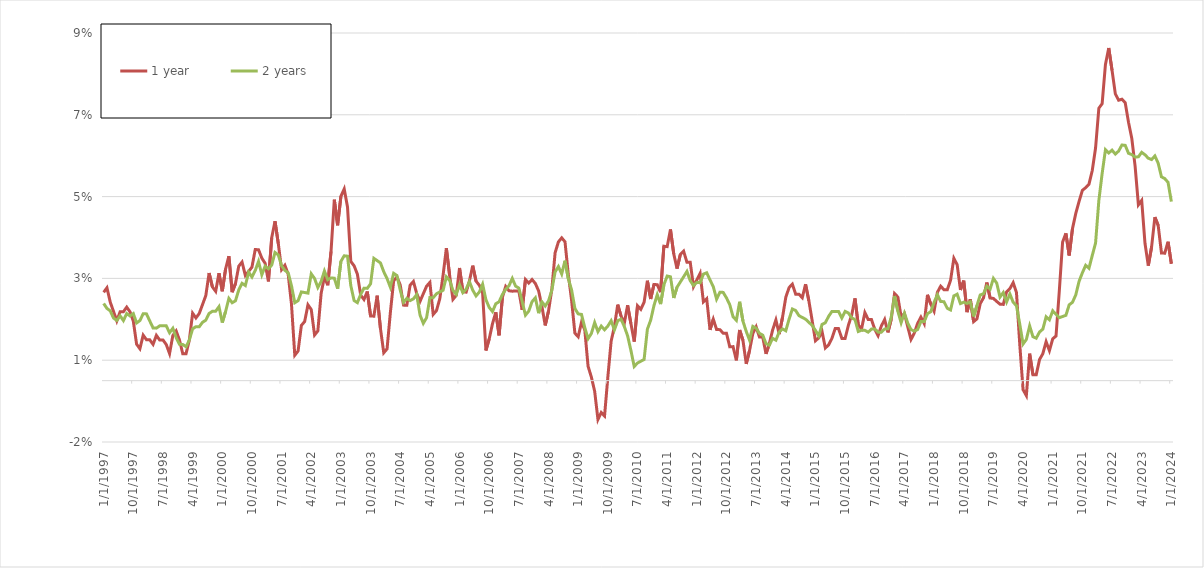
| Category | 1 year | 2 years |
|---|---|---|
| 1/1/97 | 0.022 | 0.019 |
| 2/1/97 | 0.023 | 0.018 |
| 3/1/97 | 0.019 | 0.017 |
| 4/1/97 | 0.017 | 0.015 |
| 5/1/97 | 0.015 | 0.015 |
| 6/1/97 | 0.017 | 0.016 |
| 7/1/97 | 0.017 | 0.015 |
| 8/1/97 | 0.018 | 0.016 |
| 9/1/97 | 0.017 | 0.016 |
| 10/1/97 | 0.015 | 0.016 |
| 11/1/97 | 0.009 | 0.014 |
| 12/1/97 | 0.008 | 0.015 |
| 1/1/98 | 0.011 | 0.016 |
| 2/1/98 | 0.01 | 0.016 |
| 3/1/98 | 0.01 | 0.015 |
| 4/1/98 | 0.009 | 0.013 |
| 5/1/98 | 0.011 | 0.013 |
| 6/1/98 | 0.01 | 0.013 |
| 7/1/98 | 0.01 | 0.013 |
| 8/1/98 | 0.009 | 0.013 |
| 9/1/98 | 0.007 | 0.012 |
| 10/1/98 | 0.011 | 0.013 |
| 11/1/98 | 0.012 | 0.011 |
| 12/1/98 | 0.01 | 0.009 |
| 1/1/99 | 0.007 | 0.009 |
| 2/1/99 | 0.007 | 0.008 |
| 3/1/99 | 0.01 | 0.01 |
| 4/1/99 | 0.016 | 0.013 |
| 5/1/99 | 0.015 | 0.013 |
| 6/1/99 | 0.016 | 0.013 |
| 7/1/99 | 0.019 | 0.014 |
| 8/1/99 | 0.021 | 0.015 |
| 9/1/99 | 0.026 | 0.016 |
| 10/1/99 | 0.023 | 0.017 |
| 11/1/99 | 0.022 | 0.017 |
| 12/1/99 | 0.026 | 0.018 |
| 1/1/00 | 0.022 | 0.014 |
| 2/1/00 | 0.027 | 0.017 |
| 3/1/00 | 0.03 | 0.02 |
| 4/1/00 | 0.022 | 0.019 |
| 5/1/00 | 0.024 | 0.02 |
| 6/1/00 | 0.028 | 0.022 |
| 7/1/00 | 0.029 | 0.024 |
| 8/1/00 | 0.026 | 0.023 |
| 9/1/00 | 0.027 | 0.027 |
| 10/1/00 | 0.028 | 0.025 |
| 11/1/00 | 0.032 | 0.027 |
| 12/1/00 | 0.032 | 0.029 |
| 1/1/01 | 0.03 | 0.026 |
| 2/1/01 | 0.029 | 0.028 |
| 3/1/01 | 0.024 | 0.027 |
| 4/1/01 | 0.035 | 0.028 |
| 5/1/01 | 0.039 | 0.031 |
| 6/1/01 | 0.034 | 0.031 |
| 7/1/01 | 0.027 | 0.028 |
| 8/1/01 | 0.028 | 0.027 |
| 9/1/01 | 0.026 | 0.026 |
| 10/1/01 | 0.019 | 0.023 |
| 11/1/01 | 0.006 | 0.019 |
| 12/1/01 | 0.007 | 0.02 |
| 1/1/02 | 0.013 | 0.022 |
| 2/1/02 | 0.014 | 0.022 |
| 3/1/02 | 0.019 | 0.021 |
| 4/1/02 | 0.017 | 0.026 |
| 5/1/02 | 0.011 | 0.025 |
| 6/1/02 | 0.012 | 0.023 |
| 7/1/02 | 0.021 | 0.024 |
| 8/1/02 | 0.025 | 0.027 |
| 9/1/02 | 0.023 | 0.025 |
| 10/1/02 | 0.032 | 0.025 |
| 11/1/02 | 0.044 | 0.025 |
| 12/1/02 | 0.038 | 0.022 |
| 1/1/03 | 0.045 | 0.029 |
| 2/1/03 | 0.047 | 0.031 |
| 3/1/03 | 0.042 | 0.03 |
| 4/1/03 | 0.029 | 0.023 |
| 5/1/03 | 0.028 | 0.02 |
| 6/1/03 | 0.026 | 0.019 |
| 7/1/03 | 0.021 | 0.021 |
| 8/1/03 | 0.02 | 0.023 |
| 9/1/03 | 0.022 | 0.023 |
| 10/1/03 | 0.016 | 0.024 |
| 11/1/03 | 0.016 | 0.03 |
| 12/1/03 | 0.021 | 0.029 |
| 1/1/04 | 0.013 | 0.029 |
| 2/1/04 | 0.007 | 0.027 |
| 3/1/04 | 0.008 | 0.025 |
| 4/1/04 | 0.017 | 0.023 |
| 5/1/04 | 0.024 | 0.026 |
| 6/1/04 | 0.025 | 0.026 |
| 7/1/04 | 0.023 | 0.022 |
| 8/1/04 | 0.018 | 0.019 |
| 9/1/04 | 0.018 | 0.02 |
| 10/1/04 | 0.023 | 0.02 |
| 11/1/04 | 0.024 | 0.02 |
| 12/1/04 | 0.021 | 0.021 |
| 1/1/05 | 0.019 | 0.016 |
| 2/1/05 | 0.021 | 0.014 |
| 3/1/05 | 0.023 | 0.015 |
| 4/1/05 | 0.024 | 0.02 |
| 5/1/05 | 0.016 | 0.02 |
| 6/1/05 | 0.017 | 0.021 |
| 7/1/05 | 0.02 | 0.022 |
| 8/1/05 | 0.026 | 0.022 |
| 9/1/05 | 0.032 | 0.025 |
| 10/1/05 | 0.026 | 0.025 |
| 11/1/05 | 0.02 | 0.022 |
| 12/1/05 | 0.021 | 0.021 |
| 1/1/06 | 0.028 | 0.023 |
| 2/1/06 | 0.022 | 0.022 |
| 3/1/06 | 0.022 | 0.022 |
| 4/1/06 | 0.024 | 0.024 |
| 5/1/06 | 0.028 | 0.022 |
| 6/1/06 | 0.024 | 0.021 |
| 7/1/06 | 0.023 | 0.022 |
| 8/1/06 | 0.021 | 0.024 |
| 9/1/06 | 0.007 | 0.02 |
| 10/1/06 | 0.01 | 0.018 |
| 11/1/06 | 0.014 | 0.017 |
| 12/1/06 | 0.017 | 0.019 |
| 1/1/07 | 0.011 | 0.019 |
| 2/1/07 | 0.02 | 0.021 |
| 3/1/07 | 0.023 | 0.022 |
| 4/1/07 | 0.022 | 0.023 |
| 5/1/07 | 0.022 | 0.025 |
| 6/1/07 | 0.022 | 0.023 |
| 7/1/07 | 0.022 | 0.023 |
| 8/1/07 | 0.017 | 0.019 |
| 9/1/07 | 0.025 | 0.016 |
| 10/1/07 | 0.024 | 0.017 |
| 11/1/07 | 0.025 | 0.019 |
| 12/1/07 | 0.024 | 0.02 |
| 1/1/08 | 0.022 | 0.016 |
| 2/1/08 | 0.018 | 0.019 |
| 3/1/08 | 0.014 | 0.018 |
| 4/1/08 | 0.017 | 0.019 |
| 5/1/08 | 0.022 | 0.022 |
| 6/1/08 | 0.031 | 0.027 |
| 7/1/08 | 0.034 | 0.028 |
| 8/1/08 | 0.035 | 0.026 |
| 9/1/08 | 0.034 | 0.029 |
| 10/1/08 | 0.026 | 0.025 |
| 11/1/08 | 0.02 | 0.022 |
| 12/1/08 | 0.012 | 0.018 |
| 1/1/09 | 0.011 | 0.016 |
| 2/1/09 | 0.014 | 0.016 |
| 3/1/09 | 0.012 | 0.013 |
| 4/1/09 | 0.004 | 0.01 |
| 5/1/09 | 0.001 | 0.012 |
| 6/1/09 | -0.003 | 0.014 |
| 7/1/09 | -0.009 | 0.012 |
| 8/1/09 | -0.008 | 0.013 |
| 9/1/09 | -0.009 | 0.012 |
| 10/1/09 | 0.001 | 0.013 |
| 11/1/09 | 0.01 | 0.015 |
| 12/1/09 | 0.013 | 0.012 |
| 1/1/10 | 0.019 | 0.015 |
| 2/1/10 | 0.016 | 0.015 |
| 3/1/10 | 0.014 | 0.013 |
| 4/1/10 | 0.018 | 0.011 |
| 5/1/10 | 0.014 | 0.007 |
| 6/1/10 | 0.01 | 0.003 |
| 7/1/10 | 0.018 | 0.004 |
| 8/1/10 | 0.017 | 0.005 |
| 9/1/10 | 0.019 | 0.005 |
| 10/1/10 | 0.024 | 0.013 |
| 11/1/10 | 0.02 | 0.015 |
| 12/1/10 | 0.024 | 0.018 |
| 1/1/11 | 0.023 | 0.021 |
| 2/1/11 | 0.022 | 0.019 |
| 3/1/11 | 0.033 | 0.023 |
| 4/1/11 | 0.033 | 0.026 |
| 5/1/11 | 0.037 | 0.025 |
| 6/1/11 | 0.031 | 0.02 |
| 7/1/11 | 0.027 | 0.023 |
| 8/1/11 | 0.031 | 0.024 |
| 9/1/11 | 0.032 | 0.025 |
| 10/1/11 | 0.029 | 0.027 |
| 11/1/11 | 0.029 | 0.024 |
| 12/1/11 | 0.023 | 0.023 |
| 1/1/12 | 0.025 | 0.024 |
| 2/1/12 | 0.026 | 0.024 |
| 3/1/12 | 0.019 | 0.026 |
| 4/1/12 | 0.02 | 0.026 |
| 5/1/12 | 0.012 | 0.025 |
| 6/1/12 | 0.015 | 0.023 |
| 7/1/12 | 0.012 | 0.02 |
| 8/1/12 | 0.012 | 0.022 |
| 9/1/12 | 0.012 | 0.022 |
| 10/1/12 | 0.012 | 0.02 |
| 11/1/12 | 0.008 | 0.019 |
| 12/1/12 | 0.008 | 0.016 |
| 1/1/13 | 0.005 | 0.015 |
| 2/1/13 | 0.012 | 0.019 |
| 3/1/13 | 0.01 | 0.015 |
| 4/1/13 | 0.004 | 0.012 |
| 5/1/13 | 0.007 | 0.01 |
| 6/1/13 | 0.012 | 0.013 |
| 7/1/13 | 0.013 | 0.013 |
| 8/1/13 | 0.011 | 0.012 |
| 9/1/13 | 0.011 | 0.011 |
| 10/1/13 | 0.007 | 0.009 |
| 11/1/13 | 0.009 | 0.009 |
| 12/1/13 | 0.012 | 0.01 |
| 1/1/14 | 0.015 | 0.01 |
| 2/1/14 | 0.011 | 0.012 |
| 3/1/14 | 0.015 | 0.013 |
| 4/1/14 | 0.02 | 0.012 |
| 5/1/14 | 0.023 | 0.015 |
| 6/1/14 | 0.024 | 0.018 |
| 7/1/14 | 0.021 | 0.017 |
| 8/1/14 | 0.021 | 0.016 |
| 9/1/14 | 0.02 | 0.015 |
| 10/1/14 | 0.024 | 0.015 |
| 11/1/14 | 0.02 | 0.014 |
| 12/1/14 | 0.015 | 0.014 |
| 1/1/15 | 0.01 | 0.012 |
| 2/1/15 | 0.01 | 0.011 |
| 3/1/15 | 0.012 | 0.014 |
| 4/1/15 | 0.008 | 0.014 |
| 5/1/15 | 0.009 | 0.016 |
| 6/1/15 | 0.01 | 0.017 |
| 7/1/15 | 0.013 | 0.017 |
| 8/1/15 | 0.013 | 0.017 |
| 9/1/15 | 0.01 | 0.015 |
| 10/1/15 | 0.01 | 0.017 |
| 11/1/15 | 0.014 | 0.017 |
| 12/1/15 | 0.016 | 0.015 |
| 1/1/16 | 0.02 | 0.015 |
| 2/1/16 | 0.014 | 0.012 |
| 3/1/16 | 0.013 | 0.012 |
| 4/1/16 | 0.017 | 0.012 |
| 5/1/16 | 0.015 | 0.012 |
| 6/1/16 | 0.015 | 0.013 |
| 7/1/16 | 0.013 | 0.013 |
| 8/1/16 | 0.011 | 0.012 |
| 9/1/16 | 0.013 | 0.012 |
| 10/1/16 | 0.015 | 0.013 |
| 11/1/16 | 0.012 | 0.013 |
| 12/1/16 | 0.015 | 0.016 |
| 1/1/17 | 0.021 | 0.021 |
| 2/1/17 | 0.02 | 0.017 |
| 3/1/17 | 0.016 | 0.014 |
| 4/1/17 | 0.016 | 0.017 |
| 5/1/17 | 0.013 | 0.014 |
| 6/1/17 | 0.01 | 0.013 |
| 7/1/17 | 0.012 | 0.012 |
| 8/1/17 | 0.014 | 0.012 |
| 9/1/17 | 0.016 | 0.014 |
| 10/1/17 | 0.014 | 0.014 |
| 11/1/17 | 0.021 | 0.016 |
| 12/1/17 | 0.019 | 0.017 |
| 1/1/18 | 0.017 | 0.019 |
| 2/1/18 | 0.022 | 0.021 |
| 3/1/18 | 0.023 | 0.019 |
| 4/1/18 | 0.022 | 0.019 |
| 5/1/18 | 0.022 | 0.018 |
| 6/1/18 | 0.025 | 0.017 |
| 7/1/18 | 0.03 | 0.021 |
| 8/1/18 | 0.028 | 0.021 |
| 9/1/18 | 0.022 | 0.019 |
| 10/1/18 | 0.024 | 0.019 |
| 11/1/18 | 0.017 | 0.019 |
| 12/1/18 | 0.02 | 0.019 |
| 1/1/19 | 0.014 | 0.016 |
| 2/1/19 | 0.015 | 0.018 |
| 3/1/19 | 0.019 | 0.021 |
| 4/1/19 | 0.02 | 0.021 |
| 5/1/19 | 0.024 | 0.023 |
| 6/1/19 | 0.02 | 0.022 |
| 7/1/19 | 0.02 | 0.025 |
| 8/1/19 | 0.019 | 0.024 |
| 9/1/19 | 0.019 | 0.02 |
| 10/1/19 | 0.019 | 0.022 |
| 11/1/19 | 0.022 | 0.019 |
| 12/1/19 | 0.022 | 0.021 |
| 1/1/20 | 0.024 | 0.019 |
| 2/1/20 | 0.022 | 0.018 |
| 3/1/20 | 0.009 | 0.014 |
| 4/1/20 | -0.002 | 0.009 |
| 5/1/20 | -0.004 | 0.01 |
| 6/1/20 | 0.007 | 0.013 |
| 7/1/20 | 0.001 | 0.011 |
| 8/1/20 | 0.001 | 0.01 |
| 9/1/20 | 0.005 | 0.012 |
| 10/1/20 | 0.007 | 0.013 |
| 11/1/20 | 0.01 | 0.016 |
| 12/1/20 | 0.007 | 0.015 |
| 1/1/21 | 0.01 | 0.017 |
| 2/1/21 | 0.011 | 0.016 |
| 3/1/21 | 0.022 | 0.015 |
| 4/1/21 | 0.034 | 0.016 |
| 5/1/21 | 0.036 | 0.016 |
| 6/1/21 | 0.031 | 0.019 |
| 7/1/21 | 0.037 | 0.019 |
| 8/1/21 | 0.041 | 0.021 |
| 9/1/21 | 0.044 | 0.024 |
| 10/1/21 | 0.047 | 0.026 |
| 11/1/21 | 0.047 | 0.028 |
| 12/1/21 | 0.048 | 0.027 |
| 1/1/22 | 0.051 | 0.031 |
| 2/1/22 | 0.057 | 0.034 |
| 3/1/22 | 0.067 | 0.044 |
| 4/1/22 | 0.068 | 0.051 |
| 5/1/22 | 0.077 | 0.056 |
| 6/1/22 | 0.081 | 0.056 |
| 7/1/22 | 0.076 | 0.056 |
| 8/1/22 | 0.07 | 0.055 |
| 9/1/22 | 0.069 | 0.056 |
| 10/1/22 | 0.069 | 0.058 |
| 11/1/22 | 0.068 | 0.058 |
| 12/1/22 | 0.063 | 0.056 |
| 1/1/23 | 0.059 | 0.055 |
| 2/1/23 | 0.052 | 0.055 |
| 3/1/23 | 0.043 | 0.055 |
| 4/1/23 | 0.044 | 0.056 |
| 5/1/23 | 0.034 | 0.055 |
| 6/1/23 | 0.028 | 0.054 |
| 7/1/23 | 0.033 | 0.054 |
| 8/1/23 | 0.04 | 0.055 |
| 9/1/23 | 0.038 | 0.053 |
| 10/1/23 | 0.031 | 0.05 |
| 11/1/23 | 0.031 | 0.049 |
| 12/1/23 | 0.034 | 0.048 |
| 1/1/24 | 0.029 | 0.044 |